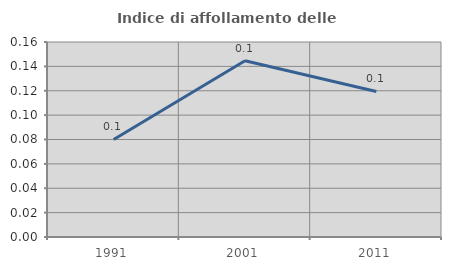
| Category | Indice di affollamento delle abitazioni  |
|---|---|
| 1991.0 | 0.08 |
| 2001.0 | 0.145 |
| 2011.0 | 0.119 |